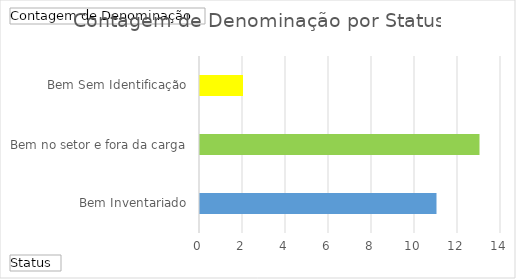
| Category | Total |
|---|---|
| Bem Inventariado | 11 |
| Bem no setor e fora da carga | 13 |
| Bem Sem Identificação | 2 |